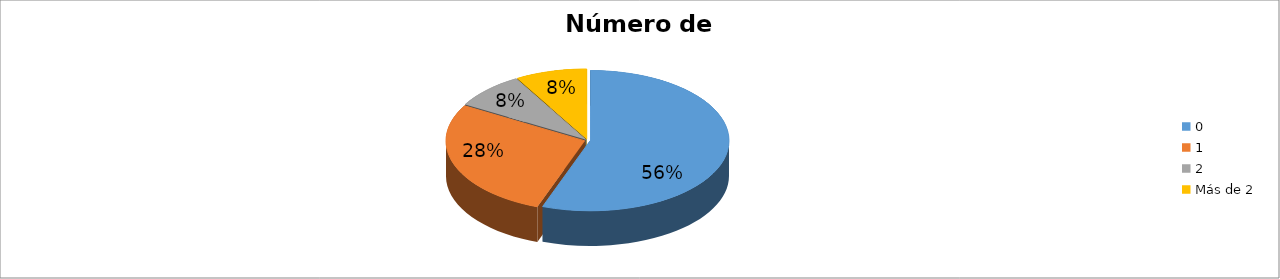
| Category | Series 0 |
|---|---|
| 0 | 0.556 |
| 1 | 0.278 |
| 2 | 0.083 |
| Más de 2 | 0.083 |